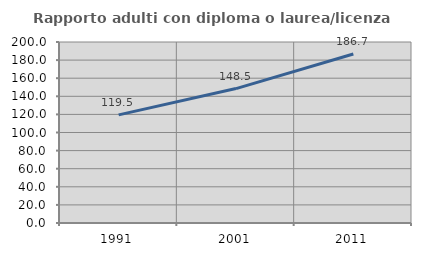
| Category | Rapporto adulti con diploma o laurea/licenza media  |
|---|---|
| 1991.0 | 119.489 |
| 2001.0 | 148.527 |
| 2011.0 | 186.674 |